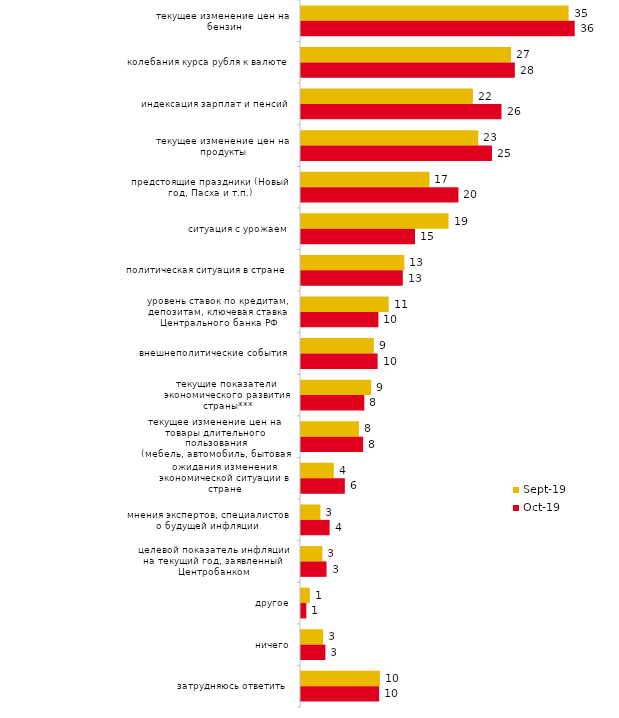
| Category | сен.19 | окт.19 |
|---|---|---|
| текущее изменение цен на бензин | 34.752 | 35.545 |
| колебания курса рубля к валюте | 27.277 | 27.772 |
| индексация зарплат и пенсий | 22.327 | 26.04 |
| текущее изменение цен на продукты | 23.02 | 24.802 |
| предстоящие праздники (Новый год, Пасха и т.п.) | 16.683 | 20.446 |
| ситуация с урожаем | 19.158 | 14.802 |
| политическая ситуация в стране | 13.416 | 13.218 |
| уровень ставок по кредитам, депозитам, ключевая ставка Центрального банка РФ | 11.386 | 10.05 |
| внешнеполитические события | 9.455 | 9.95 |
| текущие показатели экономического развития страны*** | 9.109 | 8.218 |
| текущее изменение цен на товары длительного пользования (мебель, автомобиль, бытовая техника и т.п.) | 7.525 | 8.069 |
| ожидания изменения экономической ситуации в стране | 4.257 | 5.693 |
| мнения экспертов, специалистов о будущей инфляции | 2.525 | 3.713 |
| целевой показатель инфляции на текущий год, заявленный Центробанком | 2.772 | 3.317 |
| другое | 1.139 | 0.693 |
| ничего | 2.871 | 3.168 |
| затрудняюсь ответить | 10.248 | 10.149 |